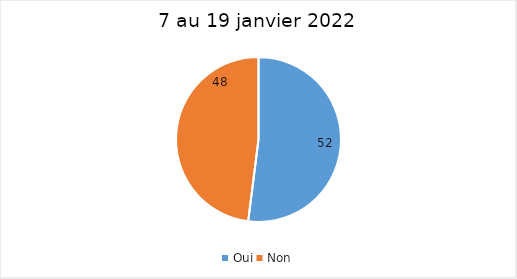
| Category | 7 au 19 janvier 2022 |
|---|---|
| Oui | 52 |
| Non | 48 |